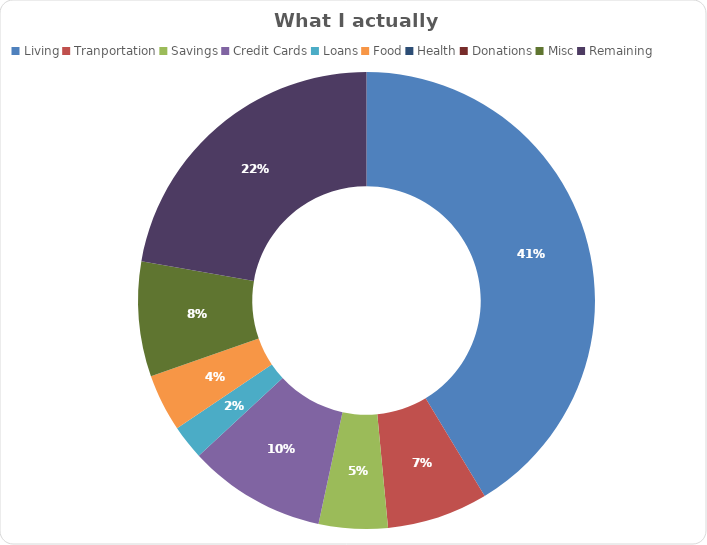
| Category | Living |
|---|---|
| Living | 2545 |
| Tranportation | 440 |
| Savings | 300 |
| Credit Cards | 600 |
| Loans | 150 |
| Food | 250 |
| Health | 0 |
| Donations | 0 |
| Misc | 500 |
| Remaining | -1370 |